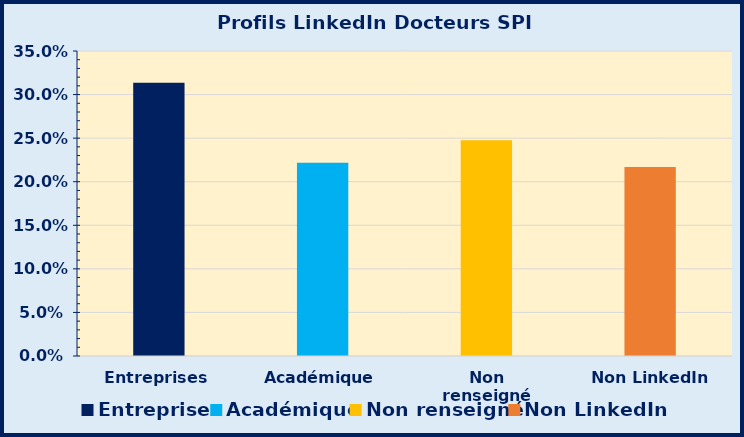
| Category | 2019 |
|---|---|
| Entreprises | 0.314 |
| Académique | 0.222 |
| Non renseigné | 0.248 |
| Non LinkedIn | 0.217 |